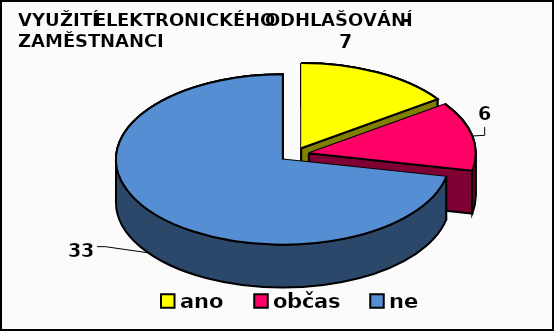
| Category | Series 0 |
|---|---|
| ano | 7 |
| občas | 6 |
| ne | 33 |